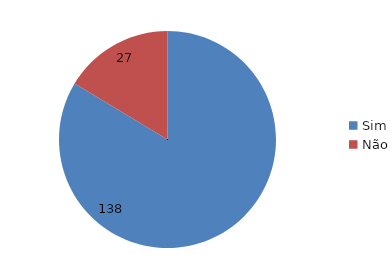
| Category | Series 0 |
|---|---|
| Sim | 138 |
| Não | 27 |